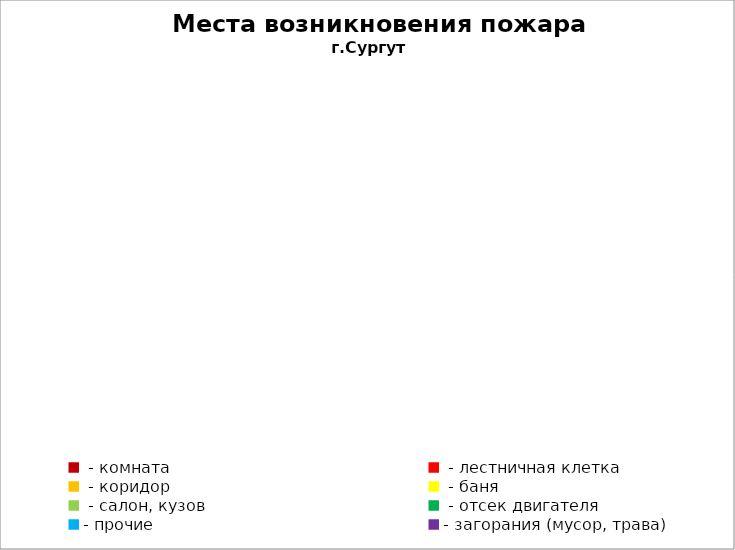
| Category | Места возникновения пожара |
|---|---|
|  - комната | 58 |
|  - лестничная клетка | 8 |
|  - коридор | 5 |
|  - баня | 29 |
|  - салон, кузов | 12 |
|  - отсек двигателя | 33 |
| - прочие | 98 |
| - загорания (мусор, трава)  | 40 |